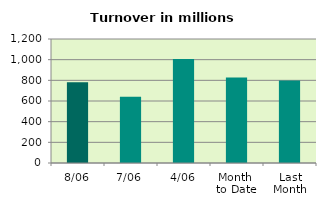
| Category | Series 0 |
|---|---|
| 8/06 | 781.52 |
| 7/06 | 640.123 |
| 4/06 | 1005.566 |
| Month 
to Date | 828.288 |
| Last
Month | 798.504 |